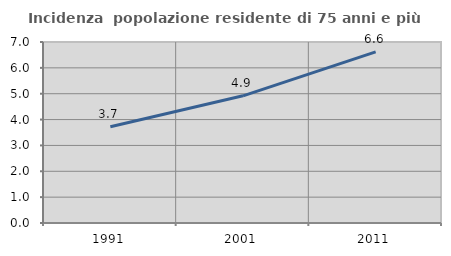
| Category | Incidenza  popolazione residente di 75 anni e più |
|---|---|
| 1991.0 | 3.725 |
| 2001.0 | 4.919 |
| 2011.0 | 6.618 |